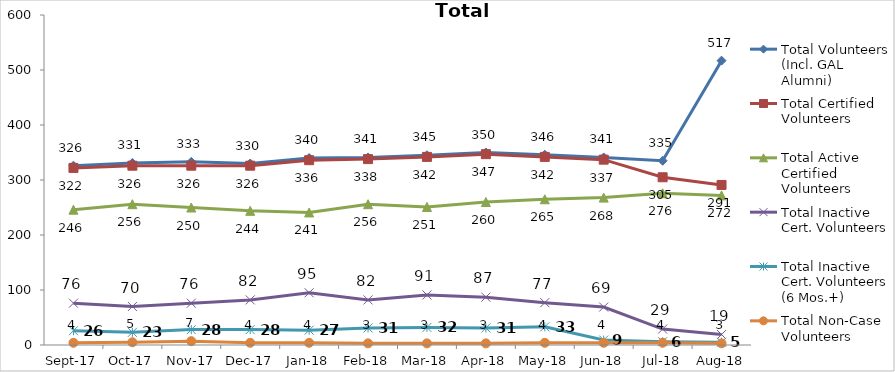
| Category | Total Volunteers (Incl. GAL Alumni) | Total Certified Volunteers | Total Active Certified Volunteers | Total Inactive Cert. Volunteers | Total Inactive Cert. Volunteers (6 Mos.+) | Total Non-Case Volunteers |
|---|---|---|---|---|---|---|
| 2017-09-01 | 326 | 322 | 246 | 76 | 26 | 4 |
| 2017-10-01 | 331 | 326 | 256 | 70 | 23 | 5 |
| 2017-11-01 | 333 | 326 | 250 | 76 | 28 | 7 |
| 2017-12-01 | 330 | 326 | 244 | 82 | 28 | 4 |
| 2018-01-01 | 340 | 336 | 241 | 95 | 27 | 4 |
| 2018-02-01 | 341 | 338 | 256 | 82 | 31 | 3 |
| 2018-03-01 | 345 | 342 | 251 | 91 | 32 | 3 |
| 2018-04-01 | 350 | 347 | 260 | 87 | 31 | 3 |
| 2018-05-01 | 346 | 342 | 265 | 77 | 33 | 4 |
| 2018-06-01 | 341 | 337 | 268 | 69 | 9 | 4 |
| 2018-07-01 | 335 | 305 | 276 | 29 | 6 | 4 |
| 2018-08-01 | 517 | 291 | 272 | 19 | 5 | 3 |